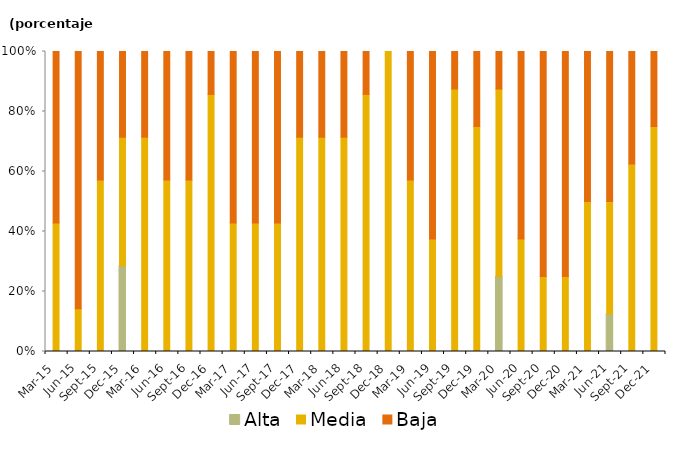
| Category | Alta | Media | Baja |
|---|---|---|---|
| 2015-03-01 | 0 | 3 | 4 |
| 2015-06-01 | 0 | 1 | 6 |
| 2015-09-01 | 0 | 4 | 3 |
| 2015-12-01 | 2 | 3 | 2 |
| 2016-03-01 | 0 | 5 | 2 |
| 2016-06-01 | 0 | 4 | 3 |
| 2016-09-01 | 0 | 4 | 3 |
| 2016-12-01 | 0 | 6 | 1 |
| 2017-03-01 | 0 | 3 | 4 |
| 2017-06-01 | 0 | 3 | 4 |
| 2017-09-01 | 0 | 3 | 4 |
| 2017-12-01 | 0 | 5 | 2 |
| 2018-03-01 | 0 | 5 | 2 |
| 2018-06-01 | 0 | 5 | 2 |
| 2018-09-01 | 0 | 6 | 1 |
| 2018-12-01 | 0 | 7 | 0 |
| 2019-03-01 | 0 | 4 | 3 |
| 2019-06-01 | 0 | 3 | 5 |
| 2019-09-01 | 0 | 7 | 1 |
| 2019-12-01 | 0 | 6 | 2 |
| 2020-03-01 | 2 | 5 | 1 |
| 2020-06-01 | 0 | 3 | 5 |
| 2020-09-01 | 0 | 2 | 6 |
| 2020-12-01 | 0 | 2 | 6 |
| 2021-03-01 | 0 | 4 | 4 |
| 2021-06-01 | 1 | 3 | 4 |
| 2021-09-01 | 0 | 5 | 3 |
| 2021-12-01 | 0 | 6 | 2 |